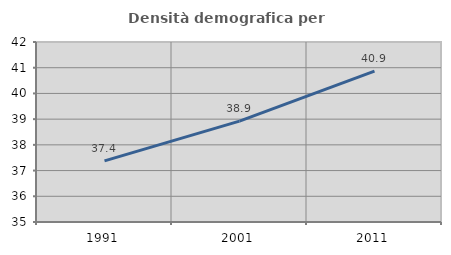
| Category | Densità demografica |
|---|---|
| 1991.0 | 37.376 |
| 2001.0 | 38.921 |
| 2011.0 | 40.867 |